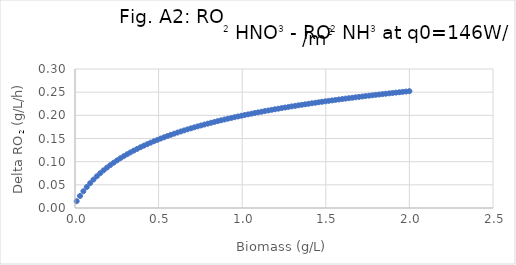
| Category | Delta RO2 (RO2 for NO3-RO2 for NH4) |
|---|---|
| 0.01 | 0.015 |
| 0.03010101 | 0.026 |
| 0.05020202 | 0.036 |
| 0.07030303 | 0.045 |
| 0.09040404 | 0.054 |
| 0.1105051 | 0.061 |
| 0.1306061 | 0.068 |
| 0.1507071 | 0.075 |
| 0.1708081 | 0.081 |
| 0.1909091 | 0.087 |
| 0.2110101 | 0.093 |
| 0.2311111 | 0.098 |
| 0.2512121 | 0.103 |
| 0.2713131 | 0.107 |
| 0.2914141 | 0.112 |
| 0.3115152 | 0.116 |
| 0.3316162 | 0.12 |
| 0.3517172 | 0.124 |
| 0.3718182 | 0.128 |
| 0.3919192 | 0.131 |
| 0.4120202 | 0.135 |
| 0.4321212 | 0.138 |
| 0.4522222 | 0.141 |
| 0.4723232 | 0.144 |
| 0.4924242 | 0.147 |
| 0.5125253 | 0.15 |
| 0.5326263 | 0.153 |
| 0.5527273 | 0.155 |
| 0.5728283 | 0.158 |
| 0.5929293 | 0.16 |
| 0.6130303 | 0.163 |
| 0.6331313 | 0.165 |
| 0.6532323 | 0.168 |
| 0.6733333 | 0.17 |
| 0.6934343 | 0.172 |
| 0.7135354 | 0.174 |
| 0.7336364 | 0.176 |
| 0.7537374 | 0.178 |
| 0.7738384 | 0.18 |
| 0.7939394 | 0.182 |
| 0.8140404 | 0.184 |
| 0.8341414 | 0.186 |
| 0.8542424 | 0.188 |
| 0.8743434 | 0.189 |
| 0.8944444 | 0.191 |
| 0.9145455 | 0.193 |
| 0.9346465 | 0.194 |
| 0.9547475 | 0.196 |
| 0.9748485 | 0.198 |
| 0.9949495 | 0.199 |
| 1.015051 | 0.201 |
| 1.035152 | 0.202 |
| 1.055253 | 0.204 |
| 1.075354 | 0.205 |
| 1.095455 | 0.206 |
| 1.115556 | 0.208 |
| 1.135657 | 0.209 |
| 1.155758 | 0.21 |
| 1.175859 | 0.212 |
| 1.19596 | 0.213 |
| 1.216061 | 0.214 |
| 1.236162 | 0.216 |
| 1.256263 | 0.217 |
| 1.276364 | 0.218 |
| 1.296465 | 0.219 |
| 1.316566 | 0.22 |
| 1.336667 | 0.222 |
| 1.356768 | 0.223 |
| 1.376869 | 0.224 |
| 1.39697 | 0.225 |
| 1.417071 | 0.226 |
| 1.437172 | 0.227 |
| 1.457273 | 0.228 |
| 1.477374 | 0.229 |
| 1.497475 | 0.23 |
| 1.517576 | 0.231 |
| 1.537677 | 0.232 |
| 1.557778 | 0.233 |
| 1.577879 | 0.234 |
| 1.59798 | 0.235 |
| 1.618081 | 0.236 |
| 1.638182 | 0.237 |
| 1.658283 | 0.238 |
| 1.678384 | 0.239 |
| 1.698485 | 0.24 |
| 1.718586 | 0.241 |
| 1.738687 | 0.242 |
| 1.758788 | 0.242 |
| 1.778889 | 0.243 |
| 1.79899 | 0.244 |
| 1.819091 | 0.245 |
| 1.839192 | 0.246 |
| 1.859293 | 0.247 |
| 1.879394 | 0.247 |
| 1.899495 | 0.248 |
| 1.919596 | 0.249 |
| 1.939697 | 0.25 |
| 1.959798 | 0.251 |
| 1.979899 | 0.251 |
| 2.0 | 0.252 |